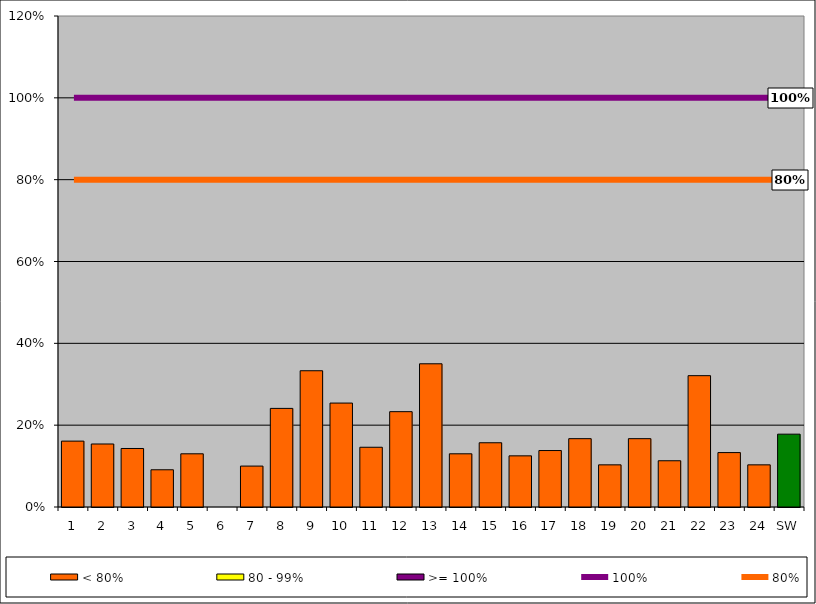
| Category | < 80% | 80 - 99% | >= 100% |
|---|---|---|---|
| 1 | 0.161 | 0 | 0 |
| 2 | 0.154 | 0 | 0 |
| 3 | 0.143 | 0 | 0 |
| 4 | 0.091 | 0 | 0 |
| 5 | 0.13 | 0 | 0 |
| 6 | 0 | 0 | 0 |
| 7 | 0.1 | 0 | 0 |
| 8 | 0.241 | 0 | 0 |
| 9 | 0.333 | 0 | 0 |
| 10 | 0.254 | 0 | 0 |
| 11 | 0.146 | 0 | 0 |
| 12 | 0.233 | 0 | 0 |
| 13 | 0.35 | 0 | 0 |
| 14 | 0.13 | 0 | 0 |
| 15 | 0.157 | 0 | 0 |
| 16 | 0.125 | 0 | 0 |
| 17 | 0.138 | 0 | 0 |
| 18 | 0.167 | 0 | 0 |
| 19 | 0.103 | 0 | 0 |
| 20 | 0.167 | 0 | 0 |
| 21 | 0.113 | 0 | 0 |
| 22 | 0.321 | 0 | 0 |
| 23 | 0.133 | 0 | 0 |
| 24 | 0.103 | 0 | 0 |
| SW | 0.178 | 0 | 0 |